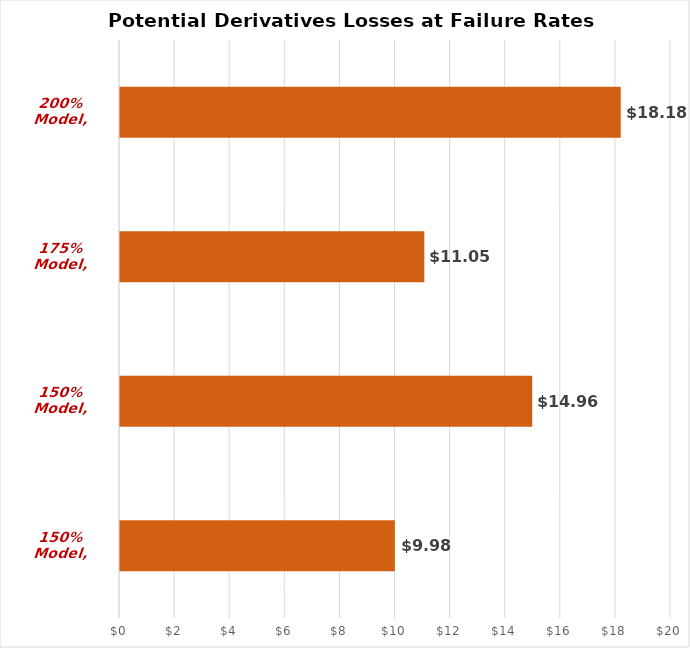
| Category | 1998-Jun-30 | 1998-Dec-31 | 1999-Jun-30 | 1999-Dec-31 | 2000-Jun-30 | 2000-Dec-31 | 2001-Jun-30 | 2001-Dec-31 | 2002-Jun-30 | 2002-Dec-31 | 2003-Jun-30 | 2003-Dec-31 | 2004-Jun-30 | 2004-Dec-31 | 2005-Jun-30 | 2005-Dec-31 | 2006-Jun-30 | 2006-Dec-31 | 2007-Jun-30 | Potential Derivatives Losses at Failure Rates |
|---|---|---|---|---|---|---|---|---|---|---|---|---|---|---|---|---|---|---|---|---|
| 150% Model, 0.50% |  |  |  |  |  |  |  |  |  |  |  |  |  |  |  |  |  |  |  | 9.975 |
| 150% Model, 0.75% |  |  |  |  |  |  |  |  |  |  |  |  |  |  |  |  |  |  |  | 14.963 |
| 175% Model, 0.50% |  |  |  |  |  |  |  |  |  |  |  |  |  |  |  |  |  |  |  | 11.046 |
| 200% Model, 0.75% |  |  |  |  |  |  |  |  |  |  |  |  |  |  |  |  |  |  |  | 18.175 |